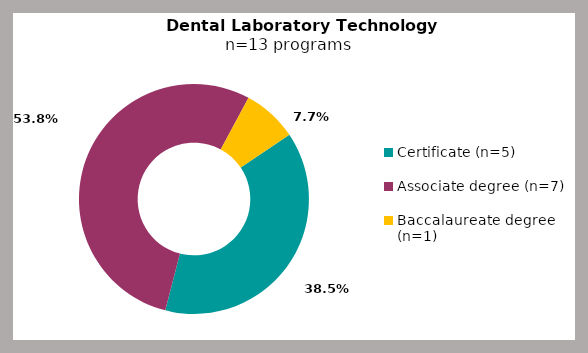
| Category | Series 0 |
|---|---|
| Certificate (n=5) | 0.385 |
| Associate degree (n=7) | 0.538 |
| Baccalaureate degree (n=1) | 0.077 |